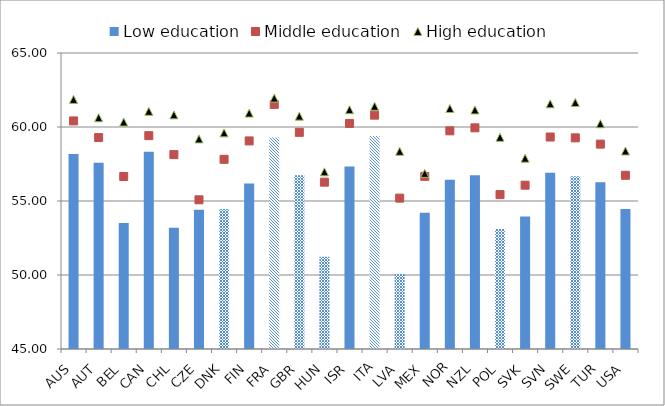
| Category | Low education |
|---|---|
| AUS | 58.171 |
| AUT | 57.577 |
| BEL | 53.521 |
| CAN | 58.326 |
| CHL | 53.201 |
| CZE | 54.405 |
| DNK | 54.453 |
| FIN | 56.179 |
| FRA | 59.299 |
| GBR | 56.743 |
| HUN | 51.226 |
| ISR | 57.329 |
| ITA | 59.4 |
| LVA | 50.078 |
| MEX | 54.204 |
| NOR | 56.437 |
| NZL | 56.733 |
| POL | 53.114 |
| SVK | 53.947 |
| SVN | 56.916 |
| SWE | 56.679 |
| TUR | 56.267 |
| USA | 54.456 |